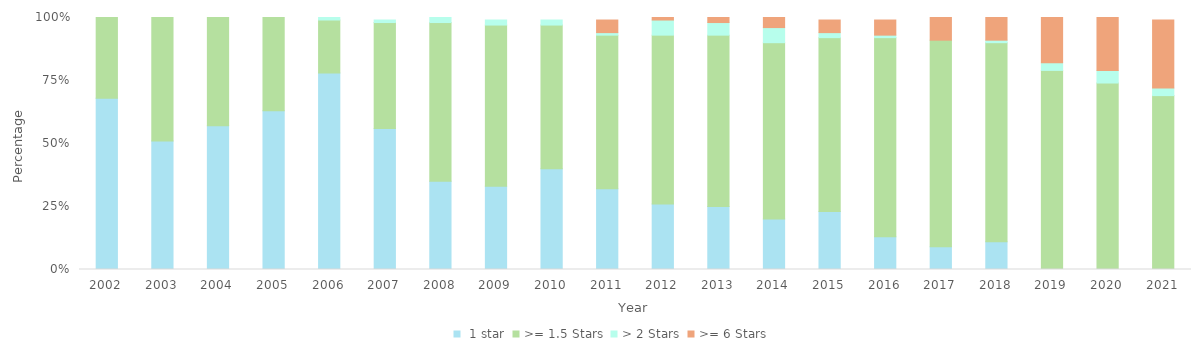
| Category |  1 star | >= 1.5 Stars | > 2 Stars | >= 6 Stars |
|---|---|---|---|---|
| 2002.0 | 0.68 | 0.32 | 0 | 0 |
| 2003.0 | 0.51 | 0.49 | 0 | 0 |
| 2004.0 | 0.57 | 0.43 | 0 | 0 |
| 2005.0 | 0.63 | 0.37 | 0 | 0 |
| 2006.0 | 0.78 | 0.21 | 0.01 | 0 |
| 2007.0 | 0.56 | 0.42 | 0.01 | 0 |
| 2008.0 | 0.35 | 0.63 | 0.02 | 0 |
| 2009.0 | 0.33 | 0.64 | 0.02 | 0 |
| 2010.0 | 0.4 | 0.57 | 0.02 | 0 |
| 2011.0 | 0.32 | 0.61 | 0.01 | 0.05 |
| 2012.0 | 0.26 | 0.67 | 0.06 | 0.01 |
| 2013.0 | 0.25 | 0.68 | 0.05 | 0.02 |
| 2014.0 | 0.2 | 0.7 | 0.06 | 0.04 |
| 2015.0 | 0.23 | 0.69 | 0.02 | 0.05 |
| 2016.0 | 0.13 | 0.79 | 0.01 | 0.06 |
| 2017.0 | 0.09 | 0.82 | 0 | 0.09 |
| 2018.0 | 0.11 | 0.79 | 0.01 | 0.1 |
| 2019.0 | 0 | 0.79 | 0.03 | 0.18 |
| 2020.0 | 0 | 0.74 | 0.05 | 0.21 |
| 2021.0 | 0 | 0.69 | 0.03 | 0.27 |